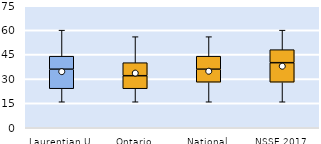
| Category | 25th | 50th | 75th |
|---|---|---|---|
| Laurentian U | 24 | 12 | 8 |
| Ontario | 24 | 8 | 8 |
| National | 28 | 8 | 8 |
| NSSE 2017 | 28 | 12 | 8 |